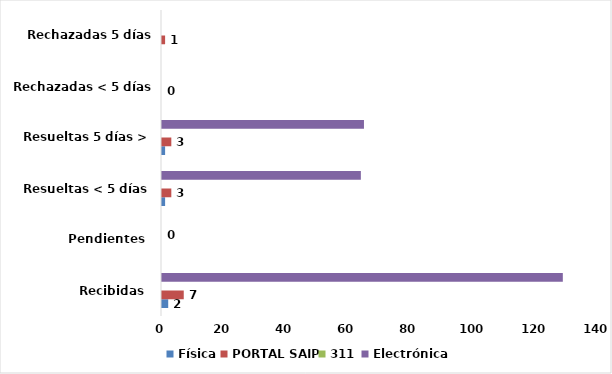
| Category | Física | PORTAL SAIP | 311 | Electrónica |
|---|---|---|---|---|
| Recibidas  | 2 | 7 | 0 | 129 |
| Pendientes  | 0 | 0 | 0 | 0 |
| Resueltas < 5 días | 1 | 3 | 0 | 64 |
| Resueltas 5 días > | 1 | 3 | 0 | 65 |
| Rechazadas < 5 días 2 | 0 | 0 | 0 | 0 |
| Rechazadas 5 días >3 | 0 | 1 | 0 | 0 |